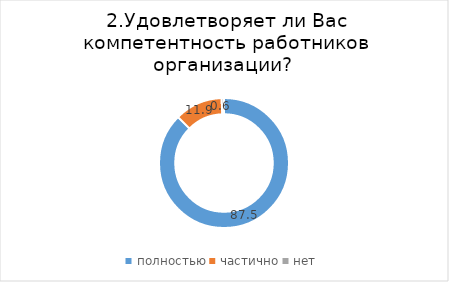
| Category | Series 0 |
|---|---|
| полностью | 87.489 |
| частично | 11.94 |
| нет | 0.571 |